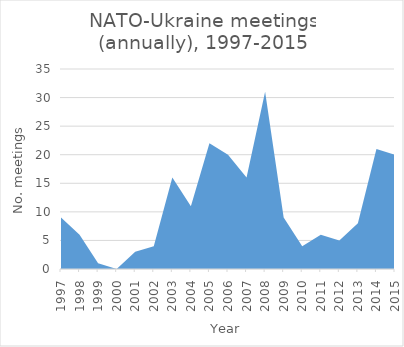
| Category | No. meetings |
|---|---|
| 1997.0 | 9 |
| 1998.0 | 6 |
| 1999.0 | 1 |
| 2000.0 | 0 |
| 2001.0 | 3 |
| 2002.0 | 4 |
| 2003.0 | 16 |
| 2004.0 | 11 |
| 2005.0 | 22 |
| 2006.0 | 20 |
| 2007.0 | 16 |
| 2008.0 | 31 |
| 2009.0 | 9 |
| 2010.0 | 4 |
| 2011.0 | 6 |
| 2012.0 | 5 |
| 2013.0 | 8 |
| 2014.0 | 21 |
| 2015.0 | 20 |